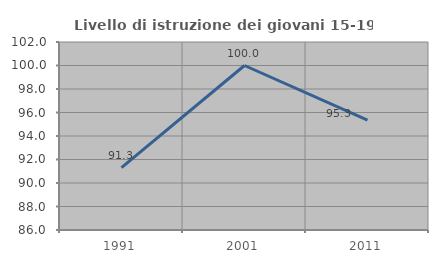
| Category | Livello di istruzione dei giovani 15-19 anni |
|---|---|
| 1991.0 | 91.304 |
| 2001.0 | 100 |
| 2011.0 | 95.349 |